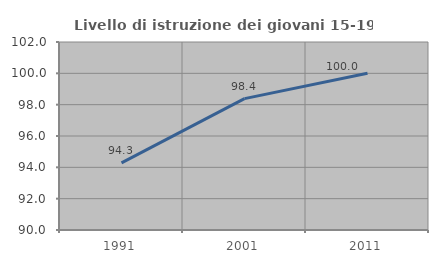
| Category | Livello di istruzione dei giovani 15-19 anni |
|---|---|
| 1991.0 | 94.286 |
| 2001.0 | 98.387 |
| 2011.0 | 100 |